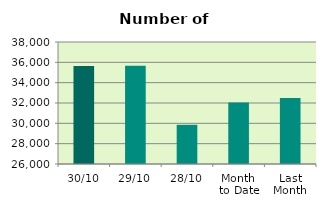
| Category | Series 0 |
|---|---|
| 30/10 | 35650 |
| 29/10 | 35654 |
| 28/10 | 29856 |
| Month 
to Date | 32059.818 |
| Last
Month | 32492.381 |